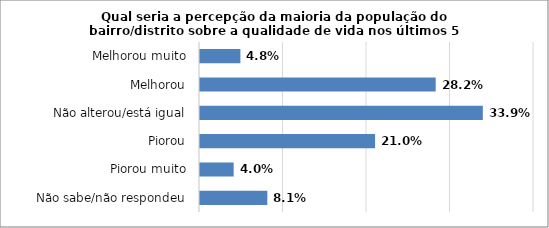
| Category | Series 0 |
|---|---|
| Não sabe/não respondeu | 0.081 |
| Piorou muito | 0.04 |
| Piorou | 0.21 |
| Não alterou/está igual | 0.339 |
| Melhorou | 0.282 |
| Melhorou muito | 0.048 |